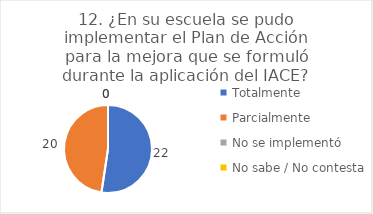
| Category | 12. ¿En su escuela se pudo implementar el Plan de Acción para la mejora que se formuló durante la aplicación del IACE? |
|---|---|
| Totalmente  | 0.524 |
| Parcialmente  | 0.476 |
| No se implementó  | 0 |
| No sabe / No contesta | 0 |